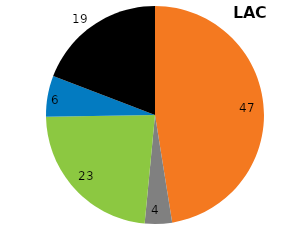
| Category | LAC |
|---|---|
| Energy | 47 |
| Industrial processes | 4 |
| Agriculture | 23 |
| Waste | 6 |
| Land-use change and forestry | 19 |